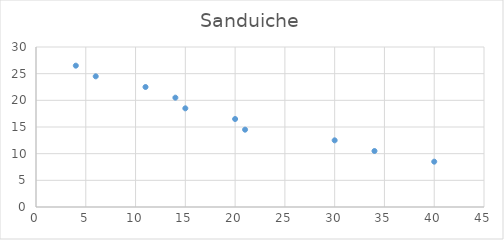
| Category | Sanduiche |
|---|---|
| 40.0 | 8.5 |
| 34.0 | 10.5 |
| 30.0 | 12.5 |
| 21.0 | 14.5 |
| 20.0 | 16.5 |
| 15.0 | 18.5 |
| 14.0 | 20.5 |
| 11.0 | 22.5 |
| 6.0 | 24.5 |
| 4.0 | 26.5 |